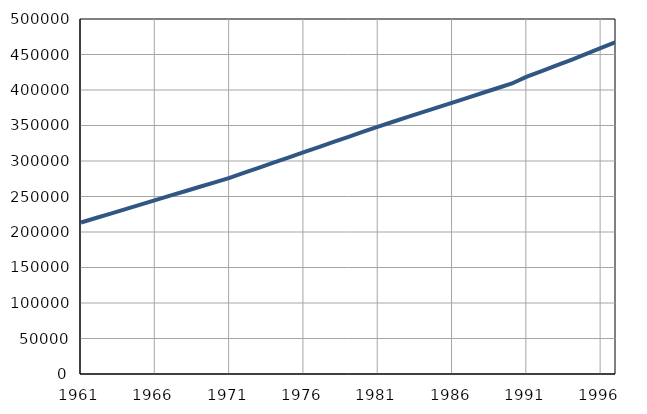
| Category | Број
становника |
|---|---|
| 1961.0 | 213423 |
| 1962.0 | 219705 |
| 1963.0 | 225987 |
| 1964.0 | 232269 |
| 1965.0 | 238551 |
| 1966.0 | 244833 |
| 1967.0 | 251115 |
| 1968.0 | 257397 |
| 1969.0 | 263679 |
| 1970.0 | 269961 |
| 1971.0 | 276243 |
| 1972.0 | 283476 |
| 1973.0 | 290709 |
| 1974.0 | 297942 |
| 1975.0 | 305175 |
| 1976.0 | 312408 |
| 1977.0 | 319641 |
| 1978.0 | 326874 |
| 1979.0 | 334107 |
| 1980.0 | 341340 |
| 1981.0 | 348557 |
| 1982.0 | 355298 |
| 1983.0 | 362039 |
| 1984.0 | 368780 |
| 1985.0 | 375521 |
| 1986.0 | 382262 |
| 1987.0 | 389003 |
| 1988.0 | 395744 |
| 1989.0 | 402485 |
| 1990.0 | 409226 |
| 1991.0 | 418800 |
| 1992.0 | 426500 |
| 1993.0 | 434700 |
| 1994.0 | 442600 |
| 1995.0 | 450900 |
| 1996.0 | 459400 |
| 1997.0 | 467500 |